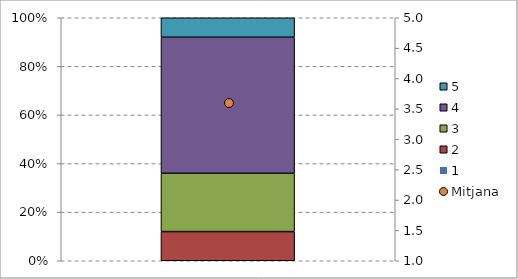
| Category | 1 | 2 | 3 | 4 | 5 |
|---|---|---|---|---|---|
| 0 | 0 | 0.12 | 0.24 | 0.56 | 0.08 |